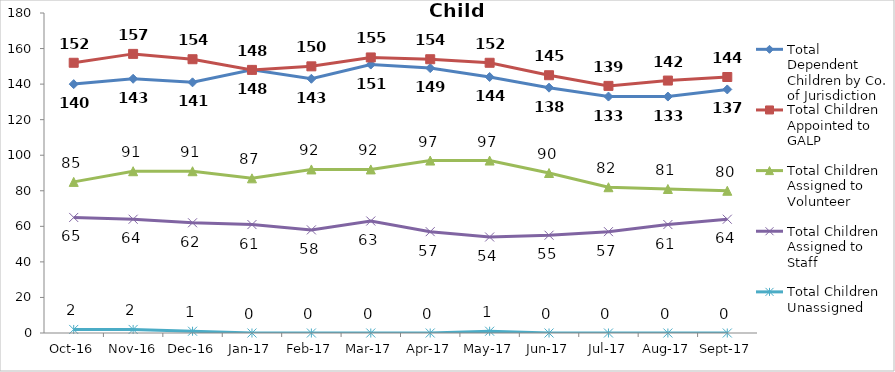
| Category | Total Dependent Children by Co. of Jurisdiction | Total Children Appointed to GALP | Total Children Assigned to Volunteer | Total Children Assigned to Staff | Total Children Unassigned |
|---|---|---|---|---|---|
| 2016-10-01 | 140 | 152 | 85 | 65 | 2 |
| 2016-11-01 | 143 | 157 | 91 | 64 | 2 |
| 2016-12-01 | 141 | 154 | 91 | 62 | 1 |
| 2017-01-01 | 148 | 148 | 87 | 61 | 0 |
| 2017-02-01 | 143 | 150 | 92 | 58 | 0 |
| 2017-03-01 | 151 | 155 | 92 | 63 | 0 |
| 2017-04-01 | 149 | 154 | 97 | 57 | 0 |
| 2017-05-01 | 144 | 152 | 97 | 54 | 1 |
| 2017-06-01 | 138 | 145 | 90 | 55 | 0 |
| 2017-07-01 | 133 | 139 | 82 | 57 | 0 |
| 2017-08-01 | 133 | 142 | 81 | 61 | 0 |
| 2017-09-01 | 137 | 144 | 80 | 64 | 0 |